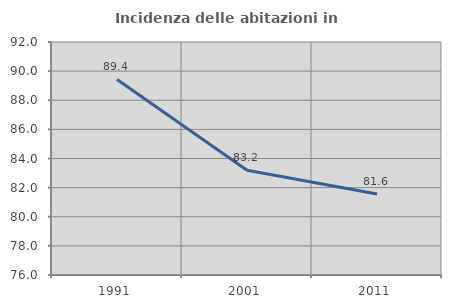
| Category | Incidenza delle abitazioni in proprietà  |
|---|---|
| 1991.0 | 89.429 |
| 2001.0 | 83.188 |
| 2011.0 | 81.562 |